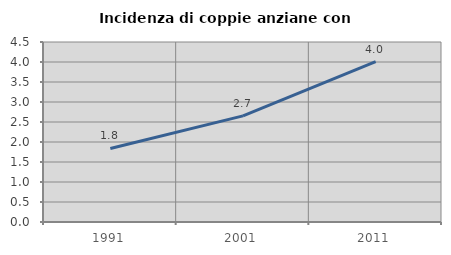
| Category | Incidenza di coppie anziane con figli |
|---|---|
| 1991.0 | 1.839 |
| 2001.0 | 2.652 |
| 2011.0 | 4.011 |